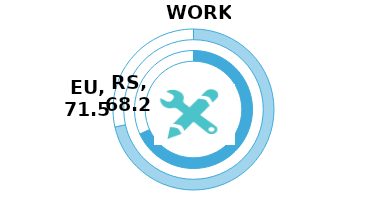
| Category | RS | Series 1 | EU |
|---|---|---|---|
| Index | 68.2 |  | 71.5 |
| Rest | 31.8 |  | 28.5 |